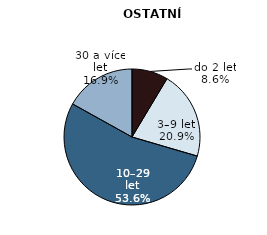
| Category | ostatní odrůdy |
|---|---|
| do 2 let | 172.937 |
| 3–9 let | 420.942 |
| 10–29 let | 1077.04 |
| 30 a více let | 340.438 |